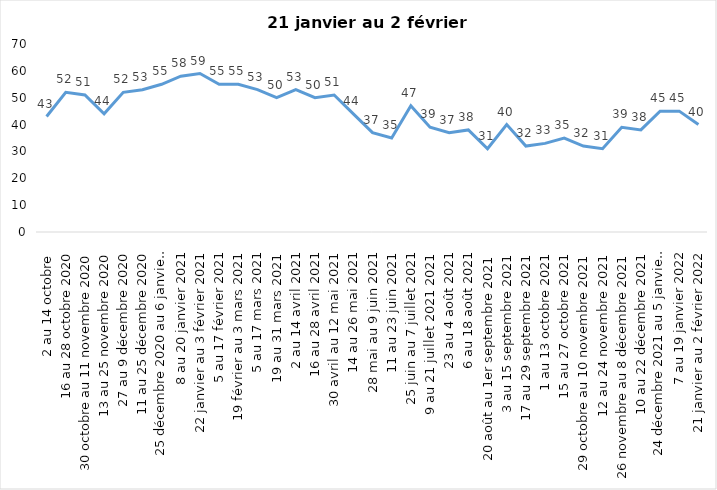
| Category | Toujours aux trois mesures |
|---|---|
| 2 au 14 octobre  | 43 |
| 16 au 28 octobre 2020 | 52 |
| 30 octobre au 11 novembre 2020 | 51 |
| 13 au 25 novembre 2020 | 44 |
| 27 au 9 décembre 2020 | 52 |
| 11 au 25 décembre 2020 | 53 |
| 25 décembre 2020 au 6 janvier 2021 | 55 |
| 8 au 20 janvier 2021 | 58 |
| 22 janvier au 3 février 2021 | 59 |
| 5 au 17 février 2021 | 55 |
| 19 février au 3 mars 2021 | 55 |
| 5 au 17 mars 2021 | 53 |
| 19 au 31 mars 2021 | 50 |
| 2 au 14 avril 2021 | 53 |
| 16 au 28 avril 2021 | 50 |
| 30 avril au 12 mai 2021 | 51 |
| 14 au 26 mai 2021 | 44 |
| 28 mai au 9 juin 2021 | 37 |
| 11 au 23 juin 2021 | 35 |
| 25 juin au 7 juillet 2021 | 47 |
| 9 au 21 juillet 2021 2021 | 39 |
| 23 au 4 août 2021 | 37 |
| 6 au 18 août 2021 | 38 |
| 20 août au 1er septembre 2021 | 31 |
| 3 au 15 septembre 2021 | 40 |
| 17 au 29 septembre 2021 | 32 |
| 1 au 13 octobre 2021 | 33 |
| 15 au 27 octobre 2021 | 35 |
| 29 octobre au 10 novembre 2021 | 32 |
| 12 au 24 novembre 2021 | 31 |
| 26 novembre au 8 décembre 2021 | 39 |
| 10 au 22 décembre 2021 | 38 |
| 24 décembre 2021 au 5 janvier 2022 2022 | 45 |
| 7 au 19 janvier 2022 | 45 |
| 21 janvier au 2 février 2022 | 40 |